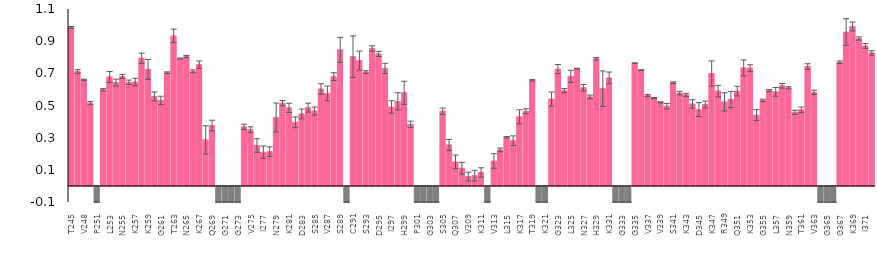
| Category | Tau_DNAJA2 |
|---|---|
| T245 | 0.986 |
| A246 | 0.712 |
| V248 | 0.66 |
| M250 | 0.515 |
| P251 | -0.1 |
| D252 | 0.598 |
| L253 | 0.677 |
| K254 | 0.642 |
| N255 | 0.68 |
| V256 | 0.644 |
| K257 | 0.646 |
| S258 | 0.794 |
| K259 | 0.725 |
| I260 | 0.556 |
| G261 | 0.532 |
| S262 | 0.704 |
| T263 | 0.933 |
| E264 | 0.792 |
| N265 | 0.804 |
| L266 | 0.713 |
| K267 | 0.754 |
| H268 | 0.286 |
| Q269 | 0.375 |
| P270 | -0.1 |
| G271 | -0.1 |
| G272 | -0.1 |
| G273 | -0.1 |
| K274 | 0.367 |
| V275 | 0.35 |
| Q276 | 0.251 |
| I277 | 0.21 |
| I278 | 0.213 |
| N279 | 0.426 |
| K280 | 0.514 |
| K281 | 0.485 |
| L282 | 0.396 |
| D283 | 0.448 |
| L284 | 0.487 |
| S285 | 0.465 |
| N286 | 0.603 |
| V287 | 0.575 |
| Q288 | 0.679 |
| S289 | 0.846 |
| K290 | -0.1 |
| C291 | 0.804 |
| G292 | 0.779 |
| S293 | 0.708 |
| K294 | 0.854 |
| D295 | 0.821 |
| N296 | 0.731 |
| I297 | 0.491 |
| K298 | 0.526 |
| H299 | 0.579 |
| V300 | 0.383 |
| P301 | -0.1 |
| G302 | -0.1 |
| G303 | -0.1 |
| G304 | -0.1 |
| S305 | 0.465 |
| V306 | 0.255 |
| Q307 | 0.149 |
| I308 | 0.11 |
| V309 | 0.058 |
| Y310 | 0.064 |
| K311 | 0.084 |
| P312 | -0.1 |
| V313 | 0.155 |
| D314 | 0.224 |
| L315 | 0.302 |
| S316 | 0.281 |
| K317 | 0.43 |
| V318 | 0.465 |
| T319 | 0.657 |
| S320 | -0.1 |
| K321 | -0.1 |
| A322 | 0.54 |
| G323 | 0.726 |
| S324 | 0.593 |
| L325 | 0.682 |
| G326 | 0.73 |
| N327 | 0.611 |
| I328 | 0.554 |
| H329 | 0.791 |
| H330 | 0.604 |
| K331 | 0.671 |
| P332 | -0.1 |
| G333 | -0.1 |
| G334 | -0.1 |
| G335 | 0.763 |
| Q336 | 0.72 |
| V337 | 0.562 |
| E338 | 0.546 |
| V339 | 0.52 |
| K340 | 0.496 |
| S341 | 0.642 |
| E342 | 0.577 |
| K343 | 0.566 |
| L344 | 0.51 |
| D345 | 0.474 |
| F346 | 0.506 |
| K347 | 0.699 |
| D348 | 0.589 |
| R349 | 0.522 |
| V350 | 0.537 |
| Q351 | 0.589 |
| S352 | 0.734 |
| K353 | 0.732 |
| I354 | 0.44 |
| G355 | 0.532 |
| S356 | 0.593 |
| L357 | 0.585 |
| D358 | 0.623 |
| N359 | 0.61 |
| I360 | 0.457 |
| T361 | 0.473 |
| H362 | 0.742 |
| V363 | 0.582 |
| P364 | -0.1 |
| G365 | -0.1 |
| G366 | -0.1 |
| G367 | 0.769 |
| N368 | 0.957 |
| K369 | 0.991 |
| K370 | 0.917 |
| I371 | 0.87 |
| E372 | 0.827 |